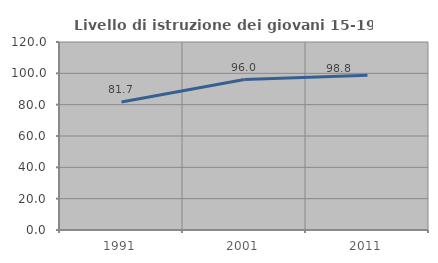
| Category | Livello di istruzione dei giovani 15-19 anni |
|---|---|
| 1991.0 | 81.741 |
| 2001.0 | 96.036 |
| 2011.0 | 98.772 |